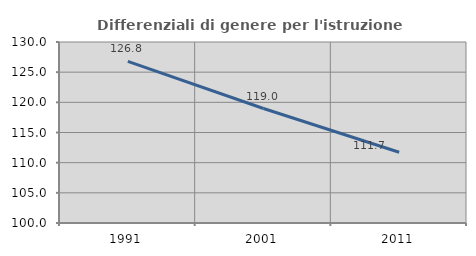
| Category | Differenziali di genere per l'istruzione superiore |
|---|---|
| 1991.0 | 126.784 |
| 2001.0 | 118.977 |
| 2011.0 | 111.726 |